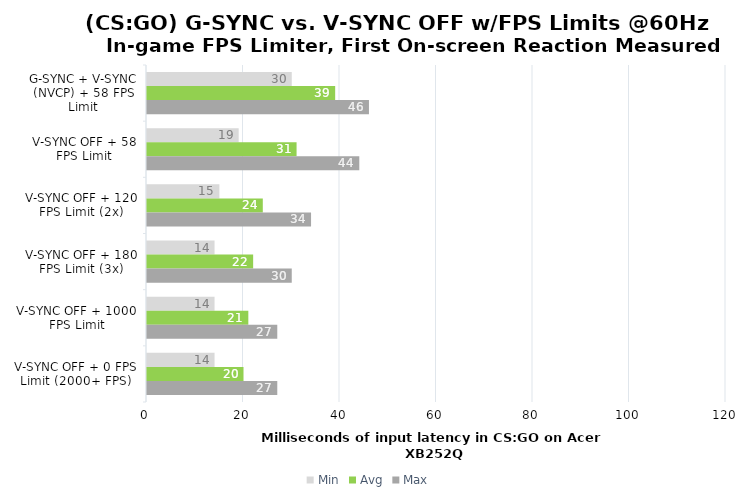
| Category | Min | Avg | Max |
|---|---|---|---|
| G-SYNC + V-SYNC (NVCP) + 58 FPS Limit | 30 | 39 | 46 |
| V-SYNC OFF + 58 FPS Limit | 19 | 31 | 44 |
| V-SYNC OFF + 120 FPS Limit (2x) | 15 | 24 | 34 |
| V-SYNC OFF + 180 FPS Limit (3x) | 14 | 22 | 30 |
| V-SYNC OFF + 1000 FPS Limit | 14 | 21 | 27 |
| V-SYNC OFF + 0 FPS Limit (2000+ FPS) | 14 | 20 | 27 |